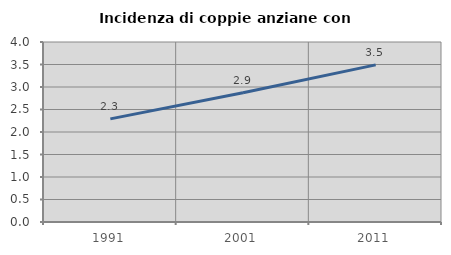
| Category | Incidenza di coppie anziane con figli |
|---|---|
| 1991.0 | 2.291 |
| 2001.0 | 2.871 |
| 2011.0 | 3.492 |